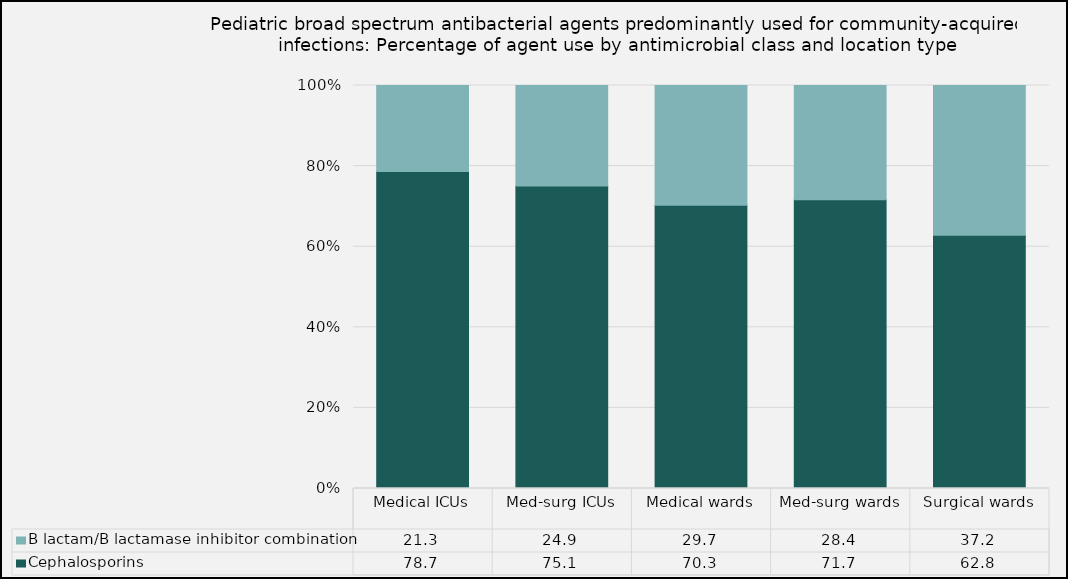
| Category | Cephalosporins | B lactam/B lactamase inhibitor combination |
|---|---|---|
| Medical ICUs | 78.68 | 21.32 |
| Med-surg ICUs | 75.07 | 24.93 |
| Medical wards | 70.27 | 29.73 |
| Med-surg wards | 71.65 | 28.35 |
| Surgical wards | 62.82 | 37.18 |